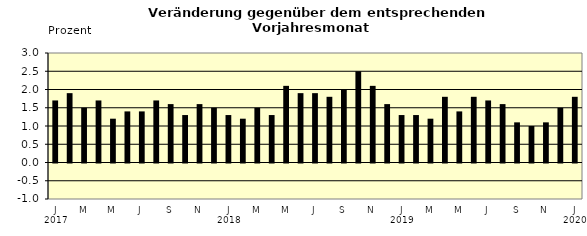
| Category | Series 0 |
|---|---|
| 0 | 1.7 |
| 1 | 1.9 |
| 2 | 1.5 |
| 3 | 1.7 |
| 4 | 1.2 |
| 5 | 1.4 |
| 6 | 1.4 |
| 7 | 1.7 |
| 8 | 1.6 |
| 9 | 1.3 |
| 10 | 1.6 |
| 11 | 1.5 |
| 12 | 1.3 |
| 13 | 1.2 |
| 14 | 1.5 |
| 15 | 1.3 |
| 16 | 2.1 |
| 17 | 1.9 |
| 18 | 1.9 |
| 19 | 1.8 |
| 20 | 2 |
| 21 | 2.5 |
| 22 | 2.1 |
| 23 | 1.6 |
| 24 | 1.3 |
| 25 | 1.3 |
| 26 | 1.2 |
| 27 | 1.8 |
| 28 | 1.4 |
| 29 | 1.8 |
| 30 | 1.7 |
| 31 | 1.6 |
| 32 | 1.1 |
| 33 | 1 |
| 34 | 1.1 |
| 35 | 1.5 |
| 36 | 1.8 |